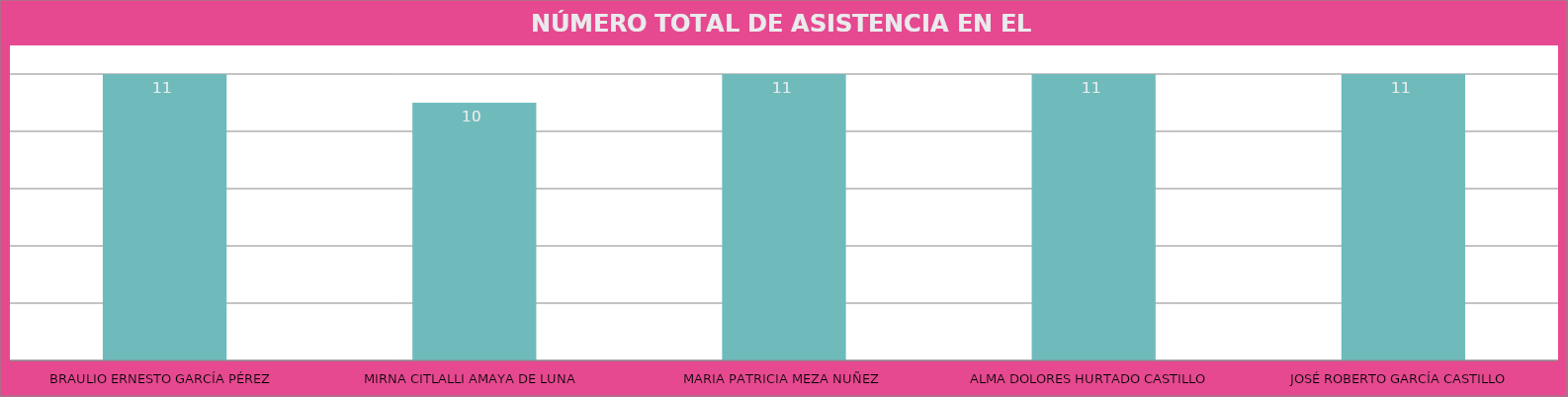
| Category | BRAULIO ERNESTO GARCÍA PÉREZ |
|---|---|
| BRAULIO ERNESTO GARCÍA PÉREZ | 11 |
| MIRNA CITLALLI AMAYA DE LUNA | 10 |
| MARIA PATRICIA MEZA NUÑEZ | 11 |
| ALMA DOLORES HURTADO CASTILLO | 11 |
| JOSÉ ROBERTO GARCÍA CASTILLO | 11 |